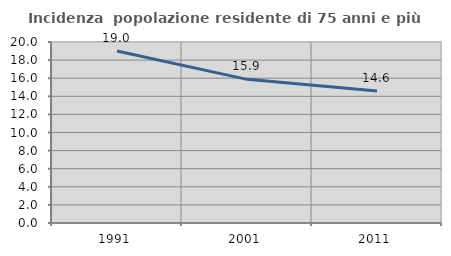
| Category | Incidenza  popolazione residente di 75 anni e più |
|---|---|
| 1991.0 | 19.012 |
| 2001.0 | 15.873 |
| 2011.0 | 14.579 |